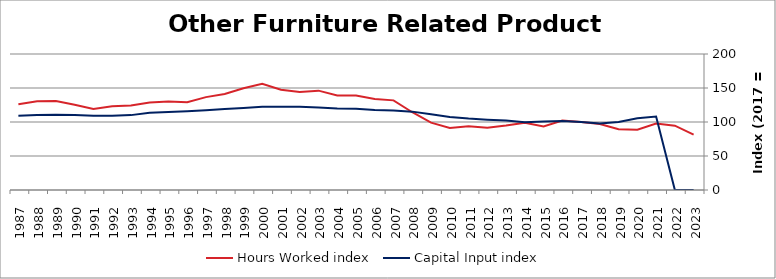
| Category | Hours Worked index | Capital Input index |
|---|---|---|
| 2023.0 | 81.332 | 0 |
| 2022.0 | 94.559 | 0 |
| 2021.0 | 97.667 | 107.959 |
| 2020.0 | 88.538 | 105.579 |
| 2019.0 | 89.292 | 99.916 |
| 2018.0 | 97.109 | 97.909 |
| 2017.0 | 100 | 100 |
| 2016.0 | 102.075 | 101.312 |
| 2015.0 | 93.54 | 100.906 |
| 2014.0 | 98.979 | 99.531 |
| 2013.0 | 94.8 | 102.05 |
| 2012.0 | 91.646 | 103.307 |
| 2011.0 | 93.863 | 104.97 |
| 2010.0 | 91.298 | 107.348 |
| 2009.0 | 99.007 | 111.243 |
| 2008.0 | 114.341 | 115.254 |
| 2007.0 | 131.8 | 116.994 |
| 2006.0 | 133.849 | 117.811 |
| 2005.0 | 139.032 | 119.563 |
| 2004.0 | 138.838 | 119.754 |
| 2003.0 | 146.119 | 121.492 |
| 2002.0 | 144.275 | 122.399 |
| 2001.0 | 147.477 | 122.467 |
| 2000.0 | 156.268 | 122.248 |
| 1999.0 | 149.736 | 120.646 |
| 1998.0 | 141.179 | 119.108 |
| 1997.0 | 136.589 | 117.34 |
| 1996.0 | 129.018 | 115.741 |
| 1995.0 | 130.014 | 114.545 |
| 1994.0 | 128.837 | 113.651 |
| 1993.0 | 124.193 | 110.116 |
| 1992.0 | 122.999 | 109.327 |
| 1991.0 | 119.279 | 109.223 |
| 1990.0 | 125.463 | 110.382 |
| 1989.0 | 130.731 | 110.724 |
| 1988.0 | 130.58 | 110.331 |
| 1987.0 | 126.239 | 109.039 |